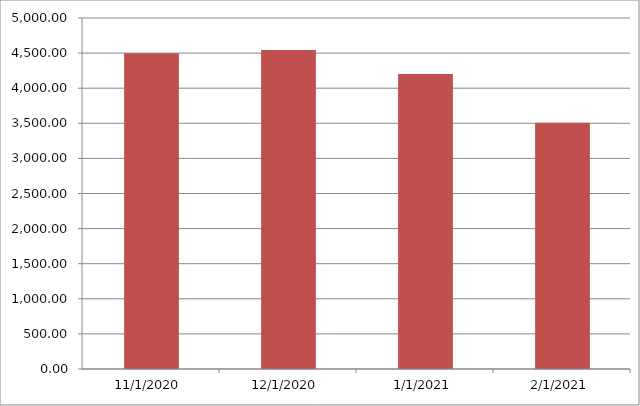
| Category | Series 0 | Series 1 |
|---|---|---|
| 11/1/20 |  | 4496.18 |
| 12/1/20 |  | 4543.43 |
| 1/1/21 |  | 4203.67 |
| 2/1/21 |  | 3507.15 |